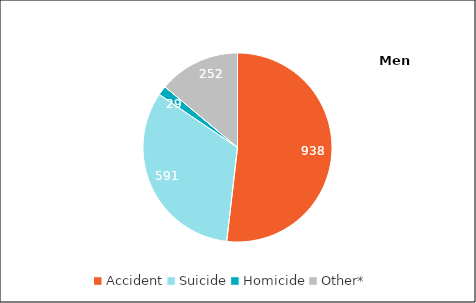
| Category | Men |
|---|---|
| Accident | 938 |
| Suicide | 591 |
| Homicide | 29 |
| Other*  | 252 |